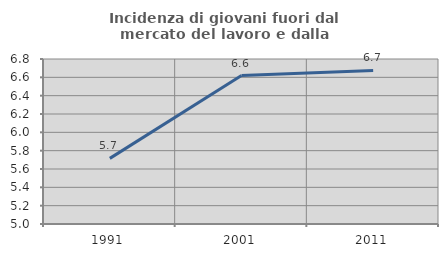
| Category | Incidenza di giovani fuori dal mercato del lavoro e dalla formazione  |
|---|---|
| 1991.0 | 5.716 |
| 2001.0 | 6.619 |
| 2011.0 | 6.675 |